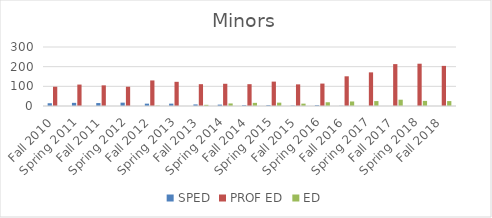
| Category | SPED | PROF ED | ED |
|---|---|---|---|
| Fall 2010 | 14 | 98 | 0 |
| Spring 2011 | 16 | 109 | 0 |
| Fall 2011 | 15 | 105 | 0 |
| Spring 2012 | 17 | 98 | 0 |
| Fall 2012 | 12 | 130 | 2 |
| Spring 2013 | 12 | 123 | 0 |
| Fall 2013 | 8 | 111 | 6 |
| Spring 2014 | 7 | 113 | 13 |
| Fall 2014 | 4 | 111 | 16 |
| Spring 2015 | 4 | 124 | 17 |
| Fall 2015 | 2 | 110 | 12 |
| Spring 2016 | 4 | 114 | 19 |
| Fall 2016 | 1 | 151 | 23 |
| Spring 2017 | 0 | 171 | 25 |
| Fall 2017 | 0 | 213 | 32 |
| Spring 2018 | 0 | 215 | 26 |
| Fall 2018 | 0 | 204 | 25 |